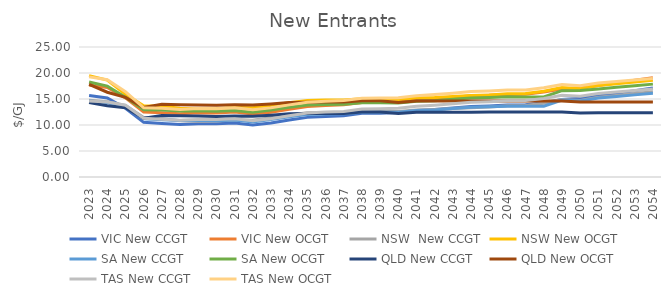
| Category | VIC | NSW  | NSW | SA | QLD | TAS |
|---|---|---|---|---|---|---|
| 2023.0 | 17.672 | 14.748 | 19.501 | 18.255 | 17.814 | 19.254 |
| 2024.0 | 17.203 | 14.483 | 18.643 | 17.472 | 16.303 | 18.718 |
| 2025.0 | 15.219 | 13.761 | 15.887 | 15.345 | 15.304 | 16.404 |
| 2026.0 | 12.507 | 11.424 | 13.707 | 12.944 | 13.354 | 13.295 |
| 2027.0 | 12.376 | 11.192 | 13.588 | 12.869 | 13.98 | 13.204 |
| 2028.0 | 12.173 | 10.824 | 13.219 | 12.687 | 13.898 | 13 |
| 2029.0 | 12.338 | 10.701 | 13.095 | 12.764 | 13.869 | 13.165 |
| 2030.0 | 12.319 | 10.746 | 13.139 | 12.662 | 13.807 | 13.146 |
| 2031.0 | 12.486 | 10.978 | 13.369 | 12.796 | 13.878 | 13.313 |
| 2032.0 | 12.103 | 10.927 | 13.316 | 12.436 | 13.823 | 12.93 |
| 2033.0 | 12.467 | 11.389 | 13.777 | 12.898 | 14.054 | 13.294 |
| 2034.0 | 13.044 | 11.915 | 14.302 | 13.409 | 14.334 | 13.871 |
| 2035.0 | 13.567 | 12.333 | 14.718 | 13.861 | 14.394 | 14.394 |
| 2036.0 | 13.756 | 12.402 | 14.785 | 13.948 | 14.4 | 14.583 |
| 2037.0 | 13.885 | 12.422 | 14.804 | 13.984 | 14.408 | 14.712 |
| 2038.0 | 14.339 | 12.674 | 15.055 | 14.268 | 14.676 | 15.166 |
| 2039.0 | 14.381 | 12.708 | 15.087 | 14.29 | 14.685 | 15.208 |
| 2040.0 | 14.445 | 12.576 | 14.898 | 14.229 | 14.344 | 15.252 |
| 2041.0 | 14.831 | 12.898 | 15.219 | 14.585 | 14.601 | 15.638 |
| 2042.0 | 15.05 | 12.975 | 15.294 | 14.663 | 14.601 | 15.857 |
| 2043.0 | 15.308 | 13.161 | 15.479 | 14.95 | 14.604 | 16.115 |
| 2044.0 | 15.612 | 13.334 | 15.651 | 15.199 | 14.606 | 16.42 |
| 2045.0 | 15.724 | 13.466 | 15.782 | 15.307 | 14.612 | 16.532 |
| 2046.0 | 15.878 | 13.715 | 16.029 | 15.411 | 14.615 | 16.711 |
| 2047.0 | 15.923 | 13.758 | 16.065 | 15.392 | 14.614 | 16.742 |
| 2048.0 | 16.353 | 14.173 | 16.475 | 15.396 | 14.614 | 17.161 |
| 2049.0 | 16.933 | 14.9 | 17.195 | 16.597 | 14.622 | 17.769 |
| 2050.0 | 17.142 | 14.72 | 16.976 | 16.645 | 14.408 | 17.536 |
| 2051.0 | 17.613 | 15.349 | 17.594 | 16.941 | 14.414 | 18.071 |
| 2052.0 | 18.096 | 15.694 | 17.928 | 17.242 | 14.417 | 18.358 |
| 2053.0 | 18.592 | 16.046 | 18.269 | 17.548 | 14.42 | 18.651 |
| 2054.0 | 19.102 | 16.407 | 18.616 | 17.859 | 14.423 | 18.948 |